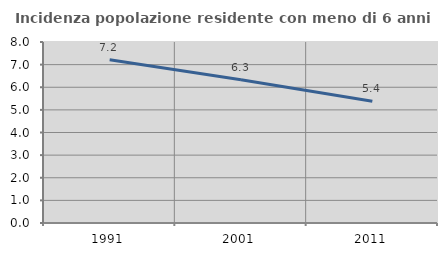
| Category | Incidenza popolazione residente con meno di 6 anni |
|---|---|
| 1991.0 | 7.213 |
| 2001.0 | 6.328 |
| 2011.0 | 5.381 |